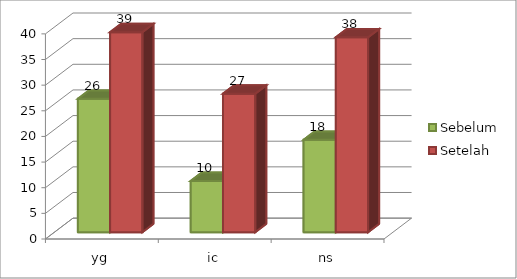
| Category | Sebelum | Setelah |
|---|---|---|
| yg | 26 | 39 |
| ic | 10 | 27 |
| ns | 18 | 38 |